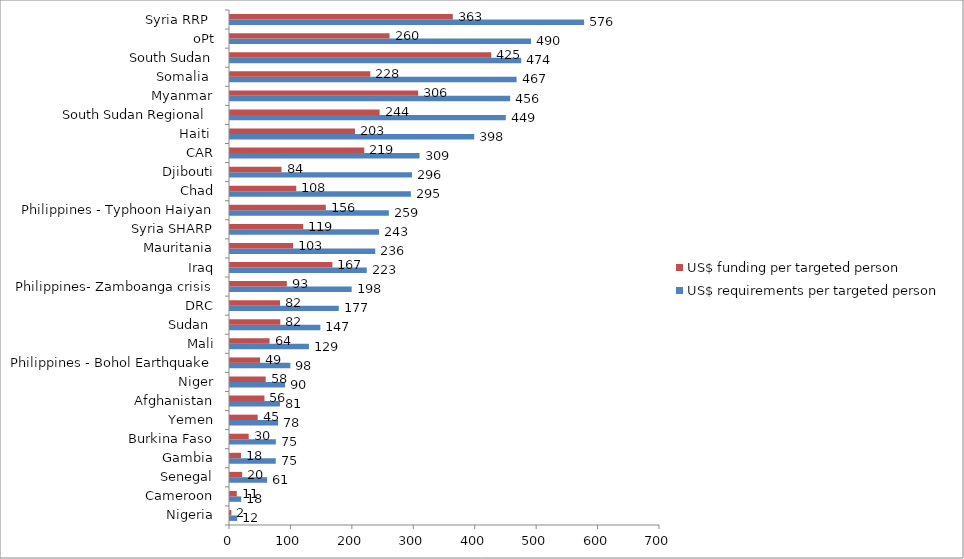
| Category | US$ requirements per targeted person | US$ funding per targeted person |
|---|---|---|
| Nigeria | 11.675 | 2.203 |
| Cameroon | 18.239 | 11.041 |
| Senegal | 60.503 | 19.719 |
| Gambia | 74.512 | 17.841 |
| Burkina Faso | 74.666 | 30.478 |
| Yemen | 78.419 | 45.069 |
| Afghanistan | 81.286 | 56.058 |
| Niger | 89.775 | 58.105 |
| Philippines - Bohol Earthquake | 98.254 | 48.929 |
| Mali | 128.572 | 64.398 |
| Sudan  | 147.119 | 81.896 |
| DRC | 177.042 | 81.5 |
| Philippines- Zamboanga crisis | 198.079 | 92.536 |
| Iraq | 222.655 | 166.706 |
| Mauritania | 236.486 | 102.685 |
| Syria SHARP | 242.602 | 119.153 |
| Philippines - Typhoon Haiyan | 258.583 | 155.969 |
| Chad | 294.504 | 107.878 |
| Djibouti | 296.34 | 83.855 |
| CAR | 308.57 | 218.569 |
| Haiti  | 397.614 | 203.443 |
| South Sudan Regional  | 448.921 | 243.599 |
| Myanmar | 456.112 | 306.336 |
| Somalia  | 466.535 | 228.383 |
| South Sudan | 474 | 425.323 |
| oPt | 490.046 | 259.761 |
| Syria RRP  | 576.372 | 362.71 |